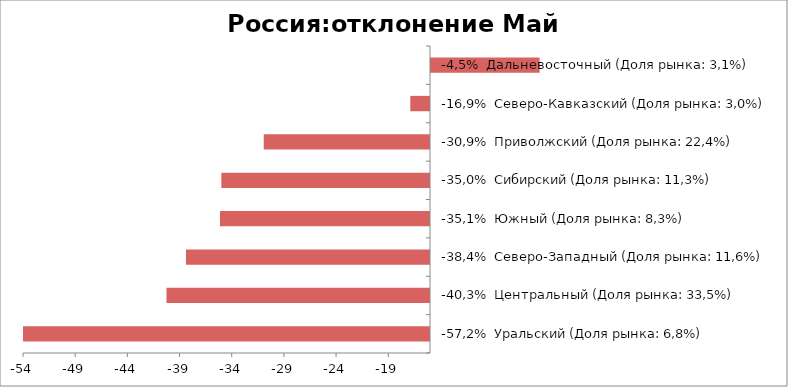
| Category | Россия:отклонение Май 2015-2014 |
|---|---|
| -57,2%  Уральский (Доля рынка: 6,8%) | -57.215 |
| -40,3%  Центральный (Доля рынка: 33,5%) | -40.251 |
| -38,4%  Северо-Западный (Доля рынка: 11,6%) | -38.383 |
| -35,1%  Южный (Доля рынка: 8,3%) | -35.125 |
| -35,0%  Сибирский (Доля рынка: 11,3%) | -34.995 |
| -30,9%  Приволжский (Доля рынка: 22,4%) | -30.932 |
| -16,9%  Северо-Кавказский (Доля рынка: 3,0%) | -16.889 |
| -4,5%  Дальневосточный (Доля рынка: 3,1%) | -4.5 |